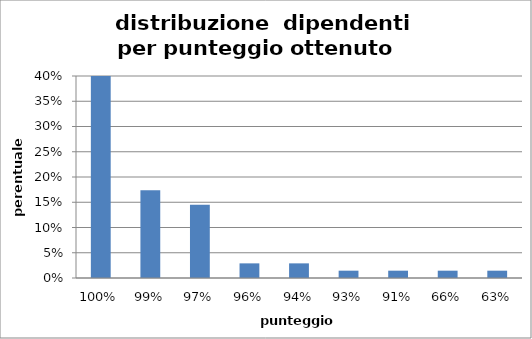
| Category | % dipendenti |
|---|---|
| 1.0 | 0.565 |
| 0.99 | 0.174 |
| 0.97 | 0.145 |
| 0.96 | 0.029 |
| 0.94 | 0.029 |
| 0.93 | 0.014 |
| 0.91 | 0.014 |
| 0.66 | 0.014 |
| 0.63 | 0.014 |